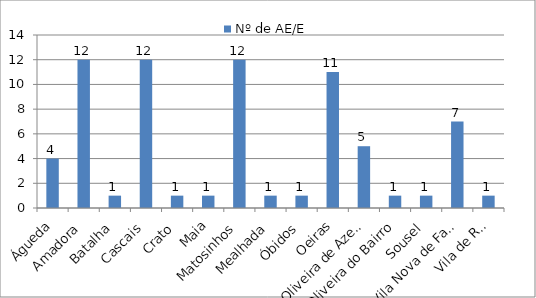
| Category | Nº de AE/E |
|---|---|
| Águeda | 4 |
| Amadora | 12 |
| Batalha | 1 |
| Cascais | 12 |
| Crato | 1 |
| Maia | 1 |
| Matosinhos | 12 |
| Mealhada | 1 |
| Óbidos | 1 |
| Oeiras | 11 |
| Oliveira de Azeméis | 5 |
| Oliveira do Bairro | 1 |
| Sousel | 1 |
| Vila Nova de Famalicão | 7 |
| Vila de Rei | 1 |